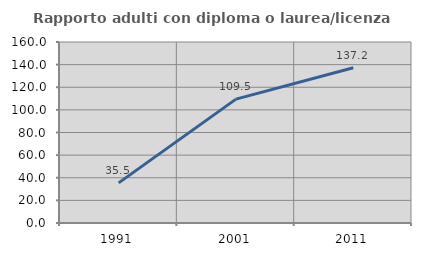
| Category | Rapporto adulti con diploma o laurea/licenza media  |
|---|---|
| 1991.0 | 35.484 |
| 2001.0 | 109.524 |
| 2011.0 | 137.179 |